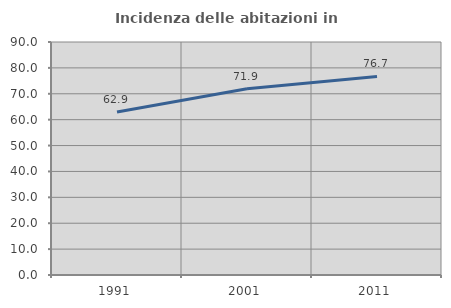
| Category | Incidenza delle abitazioni in proprietà  |
|---|---|
| 1991.0 | 62.941 |
| 2001.0 | 71.905 |
| 2011.0 | 76.7 |